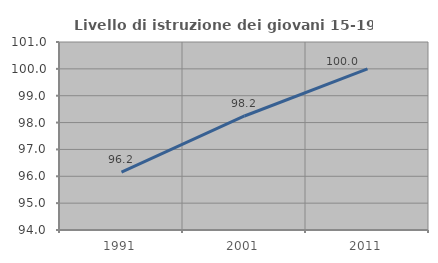
| Category | Livello di istruzione dei giovani 15-19 anni |
|---|---|
| 1991.0 | 96.154 |
| 2001.0 | 98.246 |
| 2011.0 | 100 |